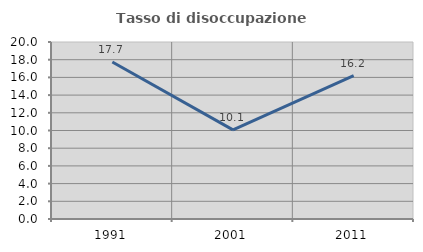
| Category | Tasso di disoccupazione giovanile  |
|---|---|
| 1991.0 | 17.747 |
| 2001.0 | 10.075 |
| 2011.0 | 16.201 |